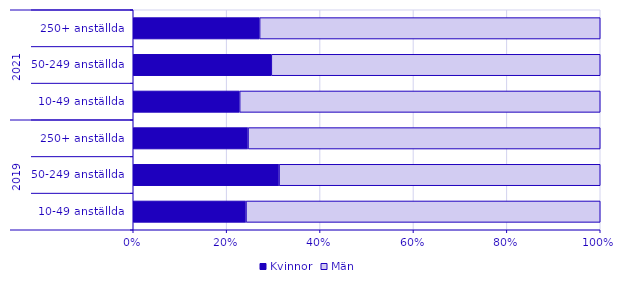
| Category | Kvinnor | Män |
|---|---|---|
| 0 | 2119 | 6659 |
| 1 | 2780 | 6124 |
| 2 | 11540 | 35418 |
| 3 | 2215 | 7506 |
| 4 | 2813 | 6700 |
| 5 | 14413 | 38854 |